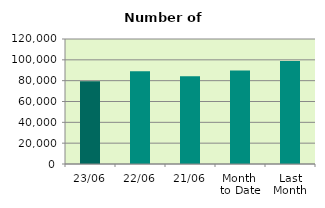
| Category | Series 0 |
|---|---|
| 23/06 | 79336 |
| 22/06 | 89020 |
| 21/06 | 84178 |
| Month 
to Date | 89698.706 |
| Last
Month | 98885.545 |